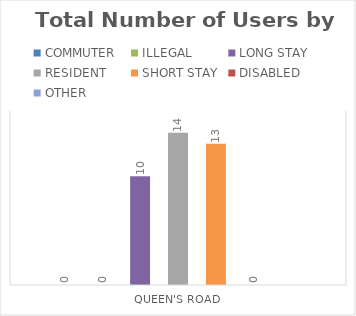
| Category | COMMUTER | ILLEGAL | LONG STAY | RESIDENT | SHORT STAY | DISABLED | OTHER |
|---|---|---|---|---|---|---|---|
| QUEEN'S ROAD | 0 | 0 | 10 | 14 | 13 | 0 | 0 |